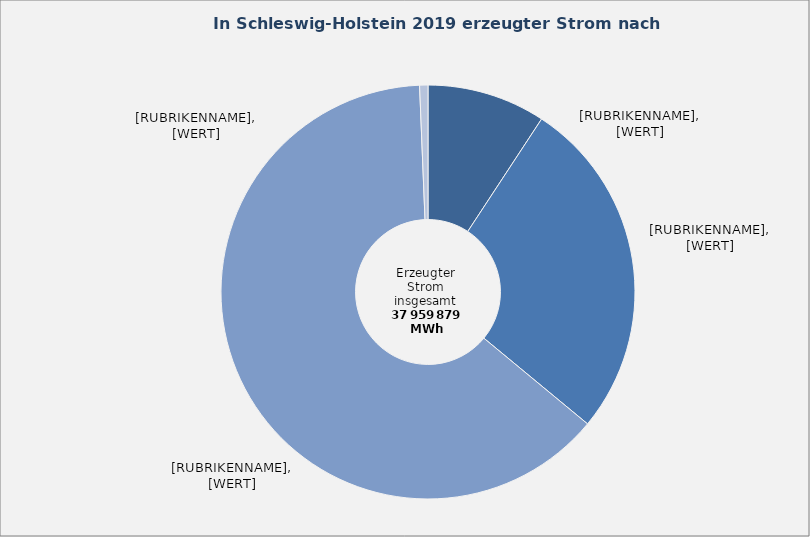
| Category | 20 – 100 ha Fläche |
|---|---|
| Fossile Energieträger | 0.092 |
| Kernenergie | 0.267 |
| Erneuerbare Energien | 0.634 |
| Abfälle und sonstige Energieträger | 0.006 |